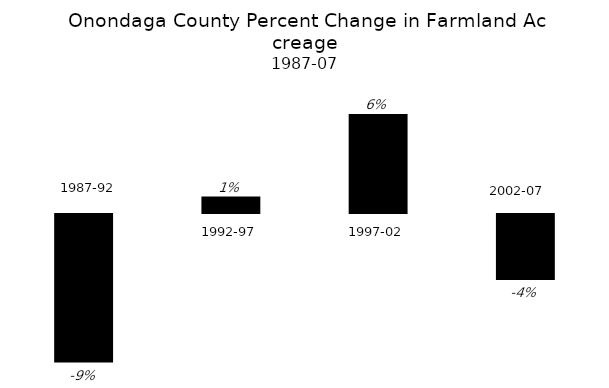
| Category | Percent Change |
|---|---|
| 1987-92 | -0.09 |
| 1992-97 | 0.01 |
| 1997-02 | 0.06 |
| 2002-07 | -0.04 |